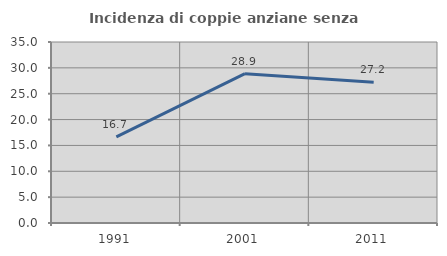
| Category | Incidenza di coppie anziane senza figli  |
|---|---|
| 1991.0 | 16.667 |
| 2001.0 | 28.873 |
| 2011.0 | 27.2 |